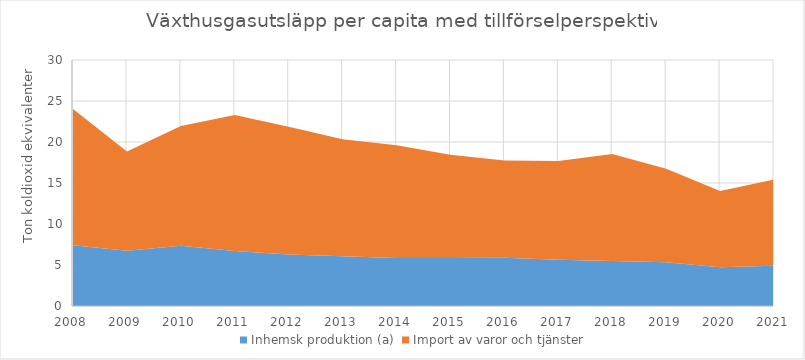
| Category | Inhemsk produktion (a) | Import av varor och tjänster |
|---|---|---|
| 2008.0 | 7.396 | 16.632 |
| 2009.0 | 6.733 | 12.102 |
| 2010.0 | 7.335 | 14.623 |
| 2011.0 | 6.706 | 16.587 |
| 2012.0 | 6.286 | 15.575 |
| 2013.0 | 6.08 | 14.269 |
| 2014.0 | 5.869 | 13.743 |
| 2015.0 | 5.864 | 12.58 |
| 2016.0 | 5.874 | 11.877 |
| 2017.0 | 5.649 | 12.02 |
| 2018.0 | 5.501 | 13.049 |
| 2019.0 | 5.32 | 11.421 |
| 2020.0 | 4.727 | 9.296 |
| 2021.0 | 4.899 | 10.538 |